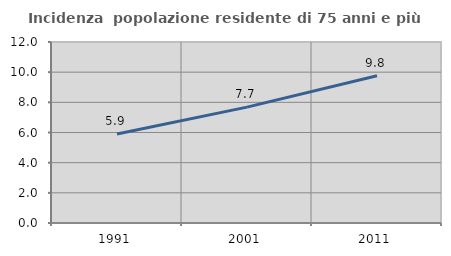
| Category | Incidenza  popolazione residente di 75 anni e più |
|---|---|
| 1991.0 | 5.9 |
| 2001.0 | 7.683 |
| 2011.0 | 9.761 |